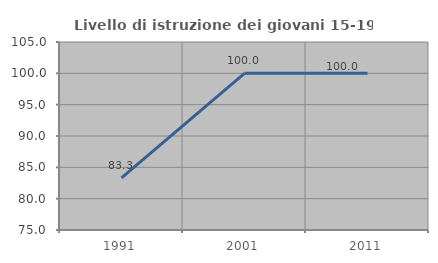
| Category | Livello di istruzione dei giovani 15-19 anni |
|---|---|
| 1991.0 | 83.333 |
| 2001.0 | 100 |
| 2011.0 | 100 |